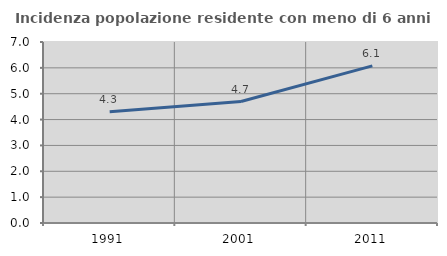
| Category | Incidenza popolazione residente con meno di 6 anni |
|---|---|
| 1991.0 | 4.301 |
| 2001.0 | 4.697 |
| 2011.0 | 6.075 |